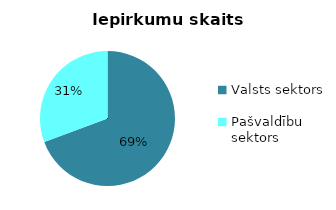
| Category | Iepirkumu skaits kopā |
|---|---|
| Valsts sektors | 594 |
| Pašvaldību sektors | 263 |